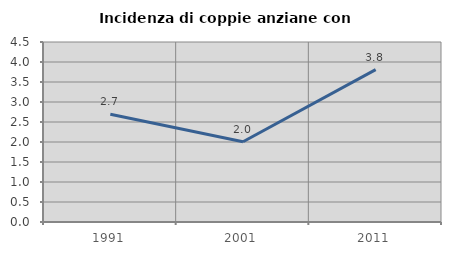
| Category | Incidenza di coppie anziane con figli |
|---|---|
| 1991.0 | 2.695 |
| 2001.0 | 2.005 |
| 2011.0 | 3.811 |